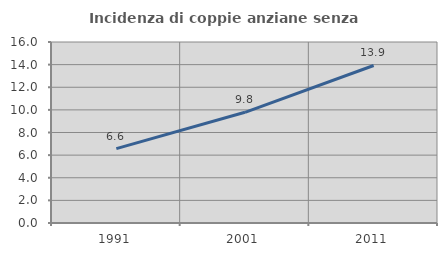
| Category | Incidenza di coppie anziane senza figli  |
|---|---|
| 1991.0 | 6.573 |
| 2001.0 | 9.786 |
| 2011.0 | 13.926 |